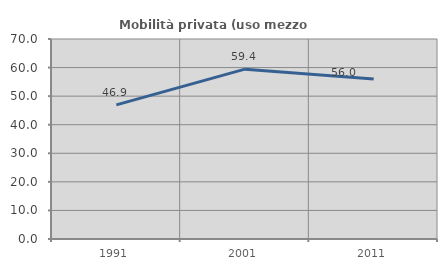
| Category | Mobilità privata (uso mezzo privato) |
|---|---|
| 1991.0 | 46.938 |
| 2001.0 | 59.439 |
| 2011.0 | 55.98 |